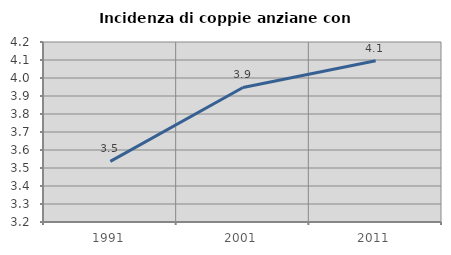
| Category | Incidenza di coppie anziane con figli |
|---|---|
| 1991.0 | 3.537 |
| 2001.0 | 3.947 |
| 2011.0 | 4.096 |